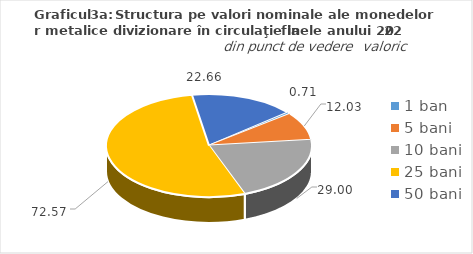
| Category | Series 0 |
|---|---|
| 1 ban | 0.71 |
| 5 bani | 12.03 |
| 10 bani | 29 |
| 25 bani | 72.57 |
| 50 bani | 22.66 |